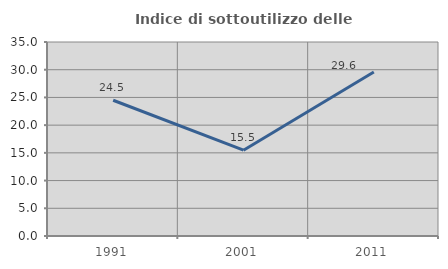
| Category | Indice di sottoutilizzo delle abitazioni  |
|---|---|
| 1991.0 | 24.49 |
| 2001.0 | 15.476 |
| 2011.0 | 29.577 |